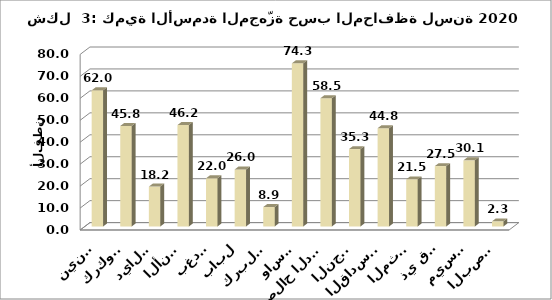
| Category | Series 0 |
|---|---|
| نينوى | 62.032 |
| كركوك | 45.796 |
| ديالى | 18.177 |
| الأنبار | 46.211 |
| بغداد | 21.966 |
| بابل | 25.981 |
| كربلاء | 8.852 |
| واسط | 74.328 |
| صلاح الدين | 58.451 |
| النجف | 35.257 |
| القادسية | 44.776 |
| المثنى | 21.476 |
| ذي قار | 27.512 |
| ميسان | 30.138 |
| البصرة | 2.333 |